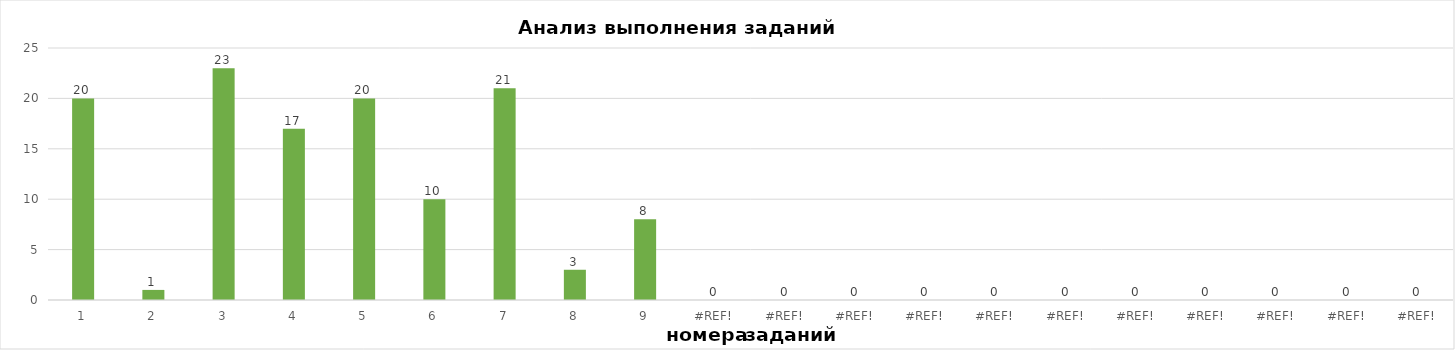
| Category | задания |
|---|---|
| 1.0 | 20 |
| 2.0 | 1 |
| 3.0 | 23 |
| 4.0 | 17 |
| 5.0 | 20 |
| 6.0 | 10 |
| 7.0 | 21 |
| 8.0 | 3 |
| 9.0 | 8 |
| 0.0 | 0 |
| 0.0 | 0 |
| 0.0 | 0 |
| 0.0 | 0 |
| 0.0 | 0 |
| 0.0 | 0 |
| 0.0 | 0 |
| 0.0 | 0 |
| 0.0 | 0 |
| 0.0 | 0 |
| 0.0 | 0 |